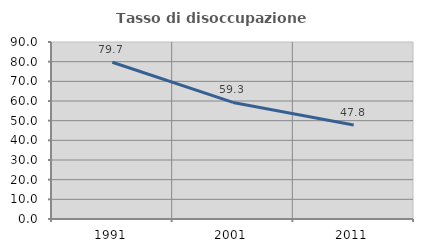
| Category | Tasso di disoccupazione giovanile  |
|---|---|
| 1991.0 | 79.683 |
| 2001.0 | 59.281 |
| 2011.0 | 47.761 |